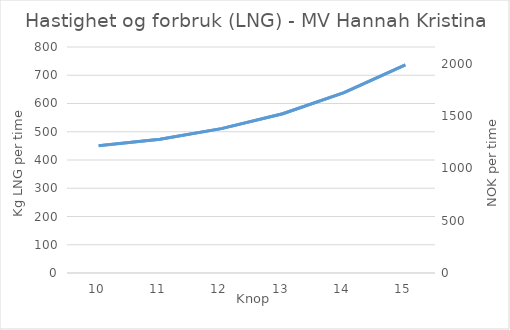
| Category | Forbruk per time (kg) |
|---|---|
| 10.0 | 450.9 |
| 11.0 | 473.445 |
| 12.0 | 511.02 |
| 13.0 | 563.625 |
| 14.0 | 638.775 |
| 15.0 | 736.47 |